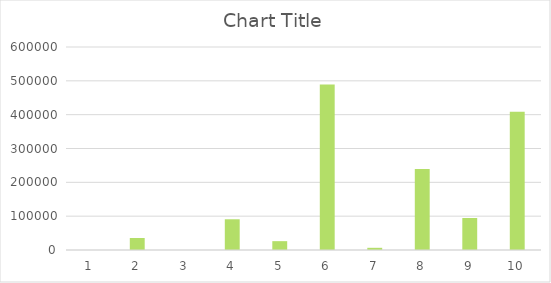
| Category | Series 0 |
|---|---|
| 0 | 0 |
| 1 | 35534 |
| 2 | 0 |
| 3 | 90832 |
| 4 | 26130 |
| 5 | 488985 |
| 6 | 6468 |
| 7 | 239612 |
| 8 | 94514.7 |
| 9 | 408297.265 |